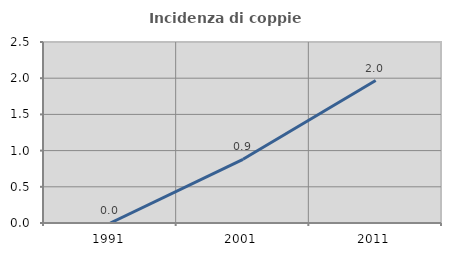
| Category | Incidenza di coppie miste |
|---|---|
| 1991.0 | 0 |
| 2001.0 | 0.88 |
| 2011.0 | 1.967 |